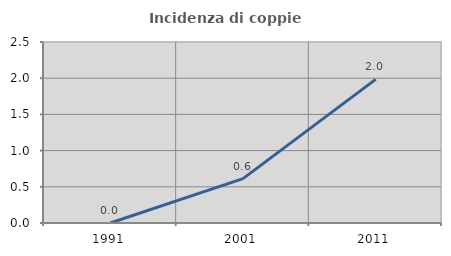
| Category | Incidenza di coppie miste |
|---|---|
| 1991.0 | 0 |
| 2001.0 | 0.613 |
| 2011.0 | 1.984 |